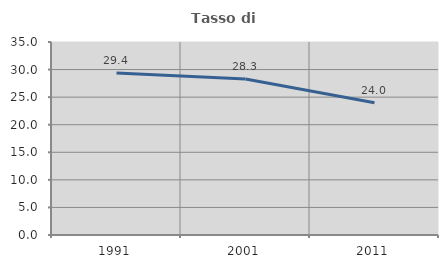
| Category | Tasso di occupazione   |
|---|---|
| 1991.0 | 29.374 |
| 2001.0 | 28.288 |
| 2011.0 | 23.978 |